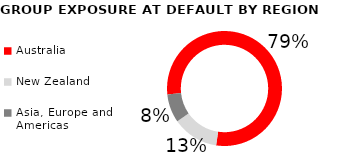
| Category | Series 1 |
|---|---|
| Australia | 0.79 |
| New Zealand | 0.13 |
| Asia, Europe and Americas | 0.08 |